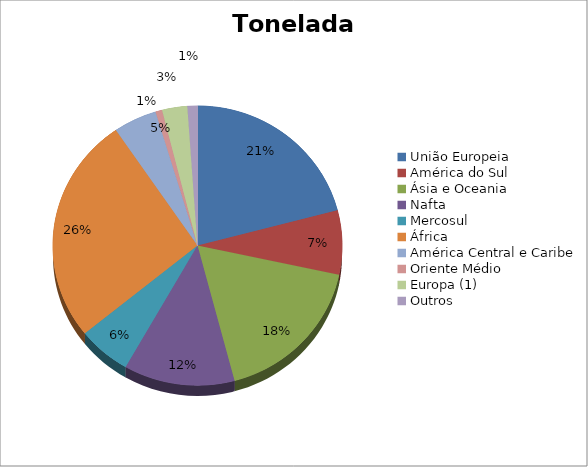
| Category | Series 0 |
|---|---|
| União Europeia | 1136263.078 |
| América do Sul | 403574.201 |
| Ásia e Oceania | 952612.682 |
| Nafta | 673176.426 |
| Mercosul | 322608.687 |
| África | 1426206.785 |
| América Central e Caribe | 263669.226 |
| Oriente Médio | 40294.485 |
| Europa (1) | 153499.247 |
| Outros | 60877.653 |